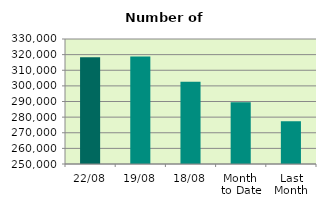
| Category | Series 0 |
|---|---|
| 22/08 | 318354 |
| 19/08 | 318728 |
| 18/08 | 302610 |
| Month 
to Date | 289441.5 |
| Last
Month | 277312.476 |